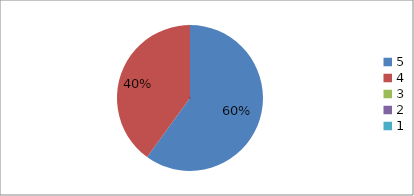
| Category | Series 0 | Series 1 |
|---|---|---|
| 5.0 | 60 | 60 |
| 4.0 | 40 | 40 |
| 3.0 | 0 | 0 |
| 2.0 | 0 | 0 |
| 1.0 | 0 | 0 |